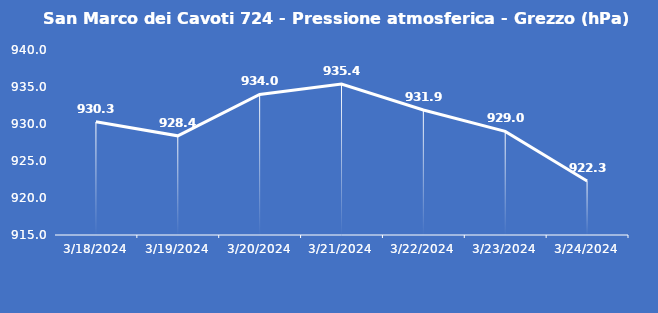
| Category | San Marco dei Cavoti 724 - Pressione atmosferica - Grezzo (hPa) |
|---|---|
| 3/18/24 | 930.3 |
| 3/19/24 | 928.4 |
| 3/20/24 | 934 |
| 3/21/24 | 935.4 |
| 3/22/24 | 931.9 |
| 3/23/24 | 929 |
| 3/24/24 | 922.3 |